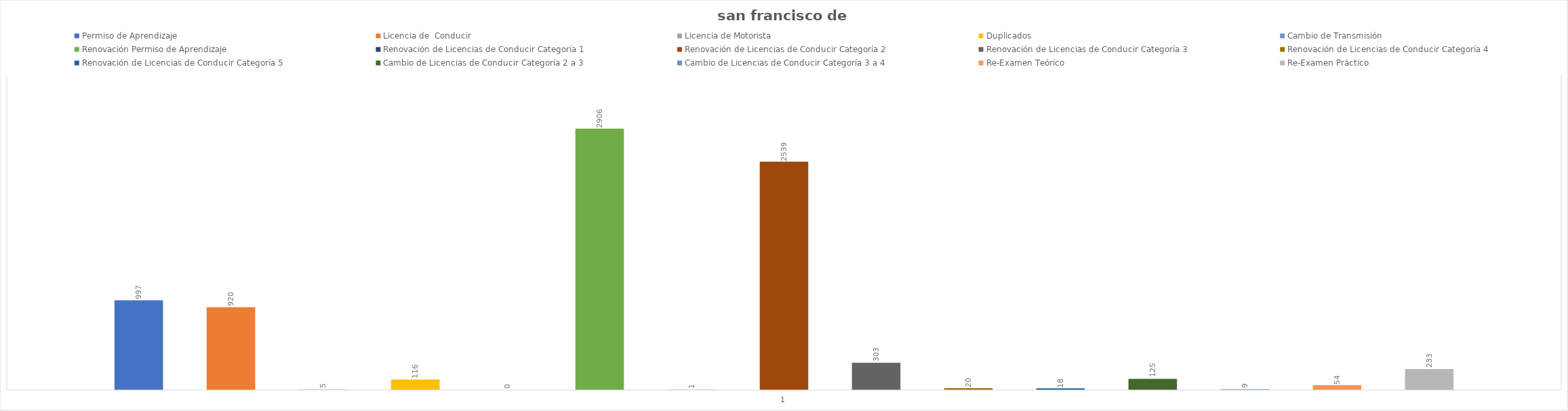
| Category | Permiso de Aprendizaje  | Licencia de  Conducir  | Licencia de Motorista | Duplicados  | Cambio de Transmisión  | Renovación Permiso de Aprendizaje | Renovación de Licencias de Conducir Categoría 1 | Renovación de Licencias de Conducir Categoría 2 | Renovación de Licencias de Conducir Categoría 3 | Renovación de Licencias de Conducir Categoría 4 | Renovación de Licencias de Conducir Categoría 5 | Cambio de Licencias de Conducir Categoría 2 a 3 | Cambio de Licencias de Conducir Categoría 3 a 4 | Re-Examen Teórico | Re-Examen Práctico |
|---|---|---|---|---|---|---|---|---|---|---|---|---|---|---|---|
| 0 | 997 | 920 | 5 | 116 | 0 | 2906 | 1 | 2539 | 303 | 20 | 18 | 125 | 9 | 54 | 233 |